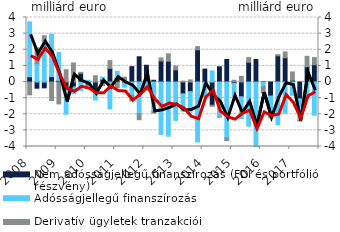
| Category | Nem adósságjellegű finanszírozás (FDI és portfólió részvény) | Adósságjellegű finanszírozás | Derivatív ügyletek tranzakciói |
|---|---|---|---|
| 2008.0 | 0.322 | 3.407 | -0.797 |
| 2008.0 | -0.385 | 1.131 | 0.986 |
| 2008.0 | -0.364 | 2.578 | 0.292 |
| 2008.0 | 0.334 | 2.628 | -1.152 |
| 2009.0 | 0.096 | 1.742 | -1.358 |
| 2009.0 | -0.495 | -1.502 | 0.758 |
| 2009.0 | -0.31 | -0.426 | 1.181 |
| 2009.0 | 0.54 | -0.537 | 0.06 |
| 2010.0 | -0.188 | 0.108 | -0.028 |
| 2010.0 | -0.709 | -0.411 | 0.384 |
| 2010.0 | 0.167 | 0.134 | -0.216 |
| 2010.0 | 0.841 | -1.672 | 0.485 |
| 2011.0 | 0.279 | 0.384 | -0.362 |
| 2011.0 | -0.045 | -0.279 | 0.301 |
| 2011.0 | 0.951 | -0.827 | -0.355 |
| 2011.0 | 1.566 | -1.967 | -0.372 |
| 2012.0 | 1.038 | -0.282 | -0.228 |
| 2012.0 | 0.107 | -1.816 | -0.112 |
| 2012.0 | 1.307 | -3.251 | 0.185 |
| 2012.0 | 1.29 | -3.363 | 0.461 |
| 2013.0 | 0.752 | -2.385 | 0.238 |
| 2013.0 | -0.734 | -1.079 | 0.057 |
| 2013.0 | -0.601 | -1.268 | 0.129 |
| 2013.0 | 2.002 | -3.715 | 0.193 |
| 2014.0 | 0.8 | -0.873 | -0.015 |
| 2014.0 | -1.445 | 0.687 | -0.062 |
| 2014.0 | 0.944 | -2.164 | -0.012 |
| 2014.0 | 1.399 | -3.458 | -0.175 |
| 2015.0 | -0.094 | -0.877 | 0.108 |
| 2015.0 | -0.918 | -1.353 | 0.349 |
| 2015.0 | 1.228 | -2.738 | 0.289 |
| 2015.0 | 1.396 | -4.058 | -0.059 |
| 2016.0 | 0.018 | -0.276 | -0.406 |
| 2016.0 | -0.87 | -1.275 | -0.078 |
| 2016.0 | 1.629 | -2.651 | 0.07 |
| 2016.0 | 1.504 | -1.939 | 0.361 |
| 2017.0 | 0.109 | -0.825 | 0.515 |
| 2017.0 | -1.045 | -1.34 | -0.027 |
| 2017.0 | 0.943 | -1.011 | 0.649 |
| 2017.0 | 1.073 | -2.059 | 0.44 |